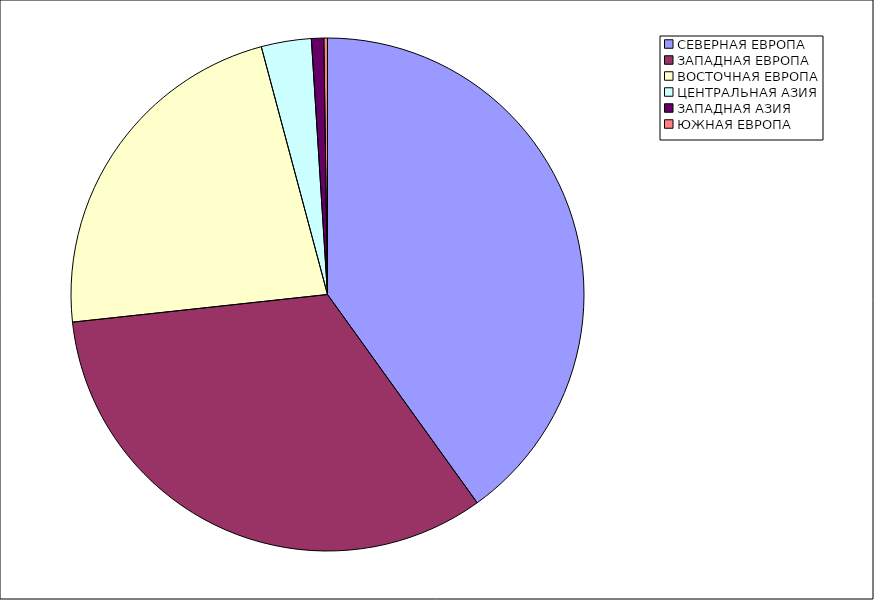
| Category | Оборот |
|---|---|
| СЕВЕРНАЯ ЕВРОПА | 40.081 |
| ЗАПАДНАЯ ЕВРОПА | 33.198 |
| ВОСТОЧНАЯ ЕВРОПА | 22.563 |
| ЦЕНТРАЛЬНАЯ АЗИЯ | 3.153 |
| ЗАПАДНАЯ АЗИЯ | 0.776 |
| ЮЖНАЯ ЕВРОПА | 0.228 |